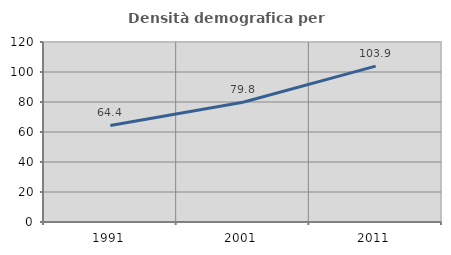
| Category | Densità demografica |
|---|---|
| 1991.0 | 64.363 |
| 2001.0 | 79.824 |
| 2011.0 | 103.946 |